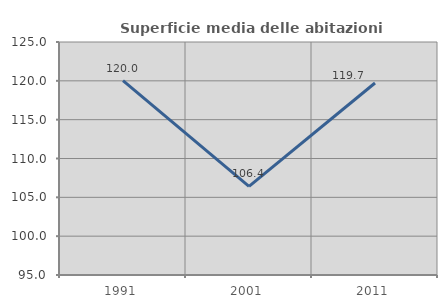
| Category | Superficie media delle abitazioni occupate |
|---|---|
| 1991.0 | 120.034 |
| 2001.0 | 106.422 |
| 2011.0 | 119.72 |